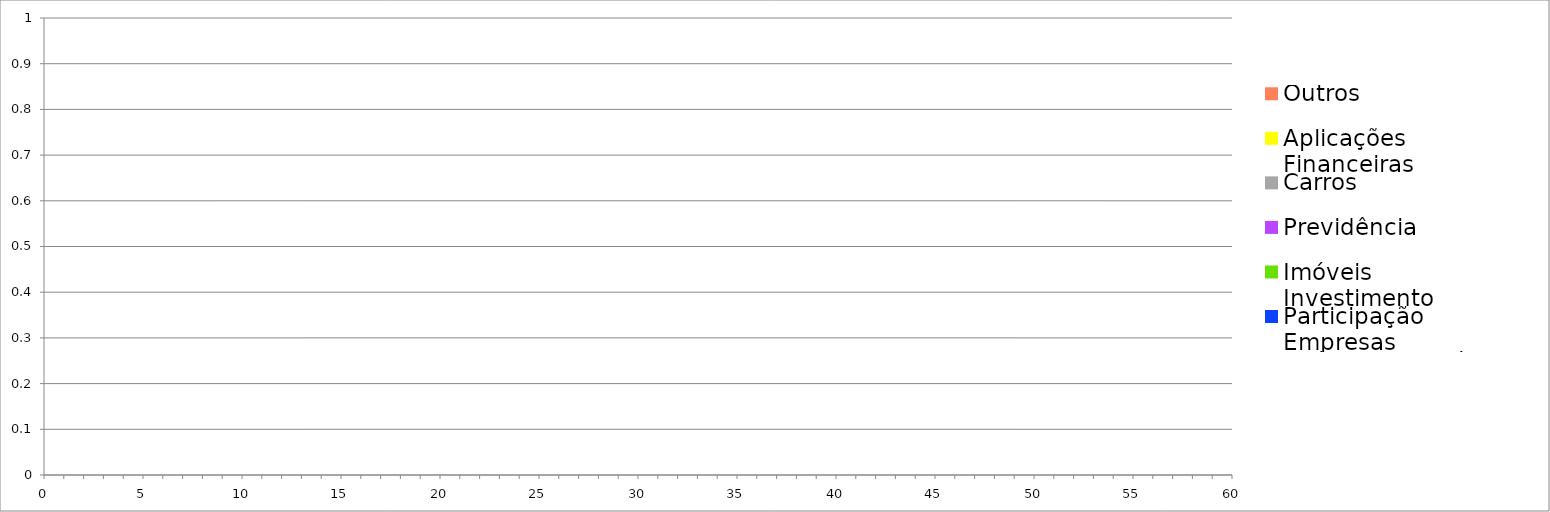
| Category | Outros | Aplicações Financeiras | Carros | Previdência | Imóveis Investimento | Participação Empresas | Imóveis Uso Próprio | Dívidas |
|---|---|---|---|---|---|---|---|---|
| 0.0 | 0 | 0 | 0 | 0 | 0 | 0 | 0 | 0 |
| 1.0 | 0 | 0 | 0 | 0 | 0 | 0 | 0 | 0 |
| 2.0 | 0 | 0 | 0 | 0 | 0 | 0 | 0 | 0 |
| 3.0 | 0 | 0 | 0 | 0 | 0 | 0 | 0 | 0 |
| 4.0 | 0 | 0 | 0 | 0 | 0 | 0 | 0 | 0 |
| 5.0 | 0 | 0 | 0 | 0 | 0 | 0 | 0 | 0 |
| 6.0 | 0 | 0 | 0 | 0 | 0 | 0 | 0 | 0 |
| 7.0 | 0 | 0 | 0 | 0 | 0 | 0 | 0 | 0 |
| 8.0 | 0 | 0 | 0 | 0 | 0 | 0 | 0 | 0 |
| 9.0 | 0 | 0 | 0 | 0 | 0 | 0 | 0 | 0 |
| 10.0 | 0 | 0 | 0 | 0 | 0 | 0 | 0 | 0 |
| 11.0 | 0 | 0 | 0 | 0 | 0 | 0 | 0 | 0 |
| 12.0 | 0 | 0 | 0 | 0 | 0 | 0 | 0 | 0 |
| 13.0 | 0 | 0 | 0 | 0 | 0 | 0 | 0 | 0 |
| 14.0 | 0 | 0 | 0 | 0 | 0 | 0 | 0 | 0 |
| 15.0 | 0 | 0 | 0 | 0 | 0 | 0 | 0 | 0 |
| 16.0 | 0 | 0 | 0 | 0 | 0 | 0 | 0 | 0 |
| 17.0 | 0 | 0 | 0 | 0 | 0 | 0 | 0 | 0 |
| 18.0 | 0 | 0 | 0 | 0 | 0 | 0 | 0 | 0 |
| 19.0 | 0 | 0 | 0 | 0 | 0 | 0 | 0 | 0 |
| 20.0 | 0 | 0 | 0 | 0 | 0 | 0 | 0 | 0 |
| 21.0 | 0 | 0 | 0 | 0 | 0 | 0 | 0 | 0 |
| 22.0 | 0 | 0 | 0 | 0 | 0 | 0 | 0 | 0 |
| 23.0 | 0 | 0 | 0 | 0 | 0 | 0 | 0 | 0 |
| 24.0 | 0 | 0 | 0 | 0 | 0 | 0 | 0 | 0 |
| 25.0 | 0 | 0 | 0 | 0 | 0 | 0 | 0 | 0 |
| 26.0 | 0 | 0 | 0 | 0 | 0 | 0 | 0 | 0 |
| 27.0 | 0 | 0 | 0 | 0 | 0 | 0 | 0 | 0 |
| 28.0 | 0 | 0 | 0 | 0 | 0 | 0 | 0 | 0 |
| 29.0 | 0 | 0 | 0 | 0 | 0 | 0 | 0 | 0 |
| 30.0 | 0 | 0 | 0 | 0 | 0 | 0 | 0 | 0 |
| 31.0 | 0 | 0 | 0 | 0 | 0 | 0 | 0 | 0 |
| 32.0 | 0 | 0 | 0 | 0 | 0 | 0 | 0 | 0 |
| 33.0 | 0 | 0 | 0 | 0 | 0 | 0 | 0 | 0 |
| 34.0 | 0 | 0 | 0 | 0 | 0 | 0 | 0 | 0 |
| 35.0 | 0 | 0 | 0 | 0 | 0 | 0 | 0 | 0 |
| 36.0 | 0 | 0 | 0 | 0 | 0 | 0 | 0 | 0 |
| 37.0 | 0 | 0 | 0 | 0 | 0 | 0 | 0 | 0 |
| 38.0 | 0 | 0 | 0 | 0 | 0 | 0 | 0 | 0 |
| 39.0 | 0 | 0 | 0 | 0 | 0 | 0 | 0 | 0 |
| 40.0 | 0 | 0 | 0 | 0 | 0 | 0 | 0 | 0 |
| 41.0 | 0 | 0 | 0 | 0 | 0 | 0 | 0 | 0 |
| 42.0 | 0 | 0 | 0 | 0 | 0 | 0 | 0 | 0 |
| 43.0 | 0 | 0 | 0 | 0 | 0 | 0 | 0 | 0 |
| 44.0 | 0 | 0 | 0 | 0 | 0 | 0 | 0 | 0 |
| 45.0 | 0 | 0 | 0 | 0 | 0 | 0 | 0 | 0 |
| 46.0 | 0 | 0 | 0 | 0 | 0 | 0 | 0 | 0 |
| 47.0 | 0 | 0 | 0 | 0 | 0 | 0 | 0 | 0 |
| 48.0 | 0 | 0 | 0 | 0 | 0 | 0 | 0 | 0 |
| 49.0 | 0 | 0 | 0 | 0 | 0 | 0 | 0 | 0 |
| 50.0 | 0 | 0 | 0 | 0 | 0 | 0 | 0 | 0 |
| 51.0 | 0 | 0 | 0 | 0 | 0 | 0 | 0 | 0 |
| 52.0 | 0 | 0 | 0 | 0 | 0 | 0 | 0 | 0 |
| 53.0 | 0 | 0 | 0 | 0 | 0 | 0 | 0 | 0 |
| 54.0 | 0 | 0 | 0 | 0 | 0 | 0 | 0 | 0 |
| 55.0 | 0 | 0 | 0 | 0 | 0 | 0 | 0 | 0 |
| 56.0 | 0 | 0 | 0 | 0 | 0 | 0 | 0 | 0 |
| 57.0 | 0 | 0 | 0 | 0 | 0 | 0 | 0 | 0 |
| 58.0 | 0 | 0 | 0 | 0 | 0 | 0 | 0 | 0 |
| 59.0 | 0 | 0 | 0 | 0 | 0 | 0 | 0 | 0 |
| 60.0 | 0 | 0 | 0 | 0 | 0 | 0 | 0 | 0 |